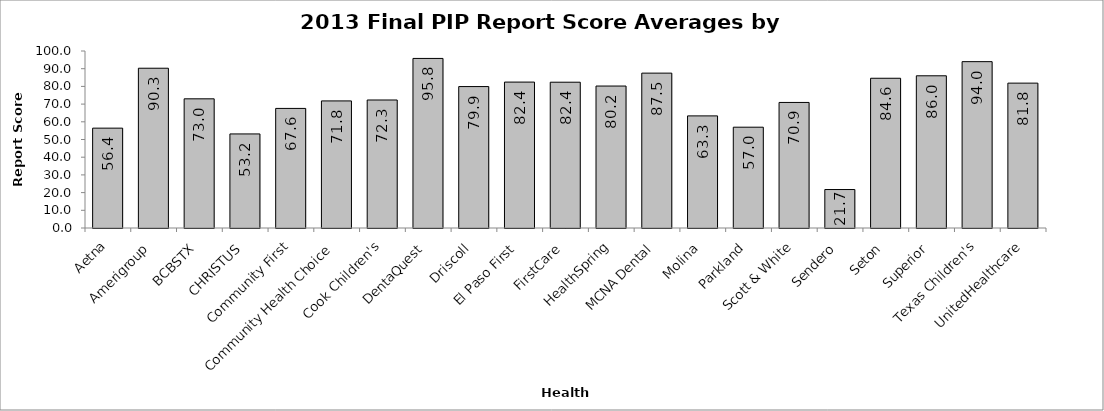
| Category | Average by Health Plan |
|---|---|
| Aetna | 56.417 |
| Amerigroup | 90.267 |
| BCBSTX | 72.983 |
| CHRISTUS | 53.15 |
| Community First | 67.567 |
| Community Health Choice | 71.8 |
| Cook Children's | 72.317 |
| DentaQuest | 95.8 |
| Driscoll | 79.9 |
| El Paso First | 82.433 |
| FirstCare | 82.367 |
| HealthSpring | 80.2 |
| MCNA Dental | 87.5 |
| Molina | 63.344 |
| Parkland | 56.95 |
| Scott & White | 70.933 |
| Sendero | 21.733 |
| Seton | 84.6 |
| Superior | 85.992 |
| Texas Children's | 93.983 |
| UnitedHealthcare | 81.844 |